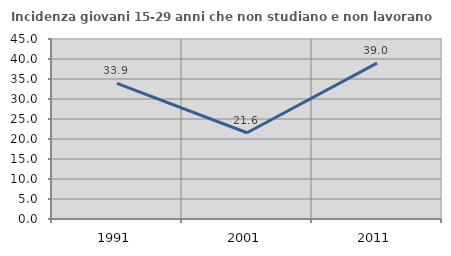
| Category | Incidenza giovani 15-29 anni che non studiano e non lavorano  |
|---|---|
| 1991.0 | 33.929 |
| 2001.0 | 21.569 |
| 2011.0 | 38.961 |